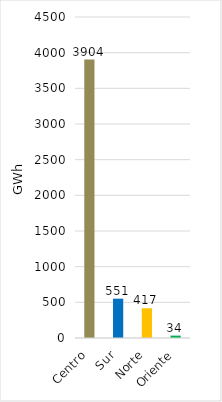
| Category | Series 0 |
|---|---|
| Centro | 3903.512 |
| Sur | 551.249 |
| Norte | 417.019 |
| Oriente | 33.632 |